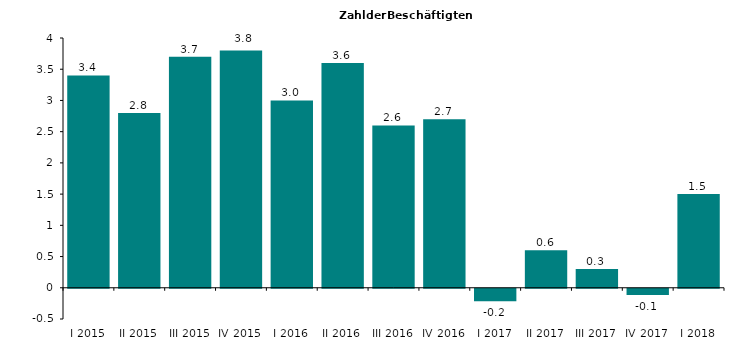
| Category | 3,4 2,8 3,7 3,8 3,0 3,6 2,6 2,7 -0,2 0,6 0,3 -0,1 1,5 |
|---|---|
| I 2015 | 3.4 |
| II 2015 | 2.8 |
| III 2015 | 3.7 |
| IV 2015 | 3.8 |
| I 2016 | 3 |
| II 2016 | 3.6 |
| III 2016 | 2.6 |
| IV 2016 | 2.7 |
| I 2017 | -0.2 |
| II 2017 | 0.6 |
| III 2017 | 0.3 |
| IV 2017 | -0.1 |
| I 2018 | 1.5 |